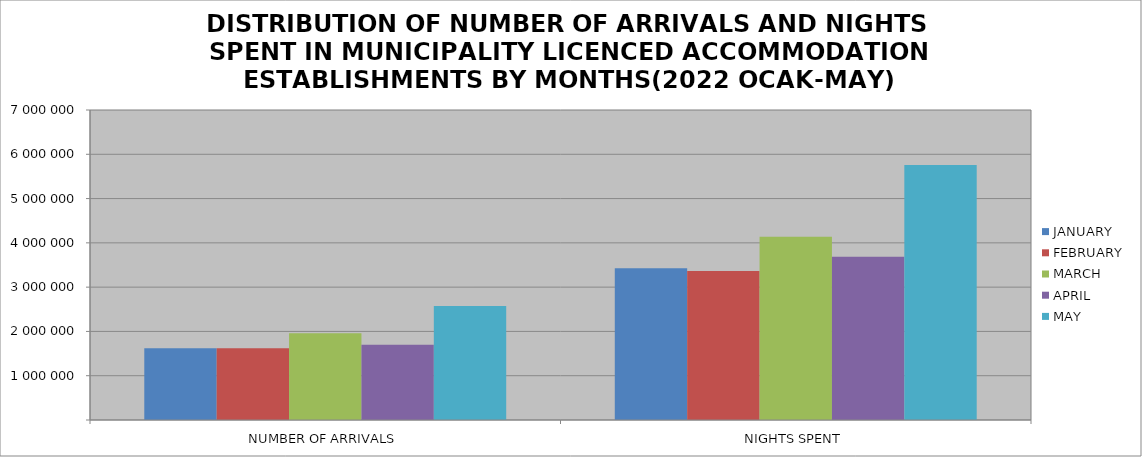
| Category | JANUARY | FEBRUARY | MARCH | APRIL | MAY |
|---|---|---|---|---|---|
| NUMBER OF ARRIVALS | 1617436 | 1619305 | 1960867 | 1699422 | 2574819 |
| NIGHTS SPENT | 3427709 | 3362025 | 4136510 | 3684991 | 5758959 |